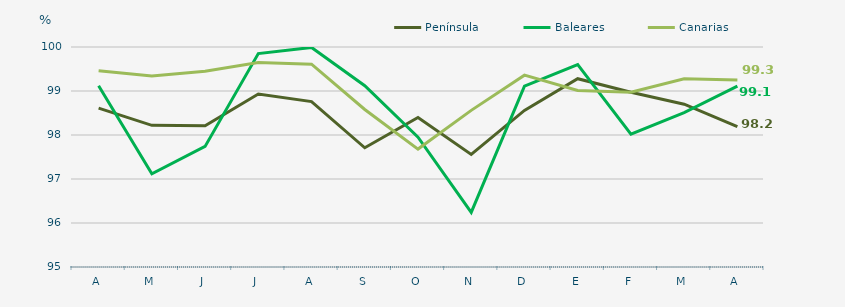
| Category | Península | Baleares | Canarias |
|---|---|---|---|
| A | 98.61 | 99.12 | 99.46 |
| M | 98.22 | 97.12 | 99.34 |
| J | 98.21 | 97.74 | 99.45 |
| J | 98.93 | 99.85 | 99.65 |
| A | 98.76 | 99.99 | 99.61 |
| S | 97.71 | 99.12 | 98.58 |
| O | 98.4 | 97.95 | 97.68 |
| N | 97.56 | 96.24 | 98.56 |
| D | 98.56 | 99.11 | 99.36 |
| E | 99.28 | 99.6 | 99.01 |
| F | 98.97 | 98.02 | 98.97 |
| M | 98.7 | 98.51 | 99.28 |
| A | 98.19 | 99.11 | 99.25 |